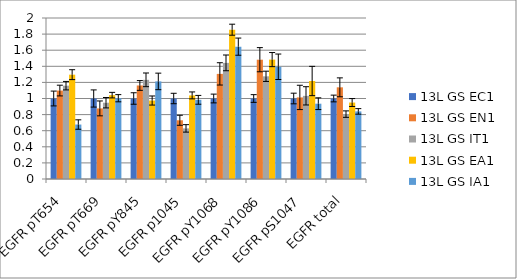
| Category | 13L GS EC1 | 13L GS EN1 | 13L GS IT1 | 13L GS EA1 | 13L GS IA1 |
|---|---|---|---|---|---|
| EGFR pT654 | 1 | 1.099 | 1.159 | 1.296 | 0.677 |
| EGFR pT669 | 1 | 0.877 | 0.948 | 1.042 | 1.003 |
| EGFR pY845 | 1 | 1.162 | 1.232 | 0.975 | 1.212 |
| EGFR p1045 | 1 | 0.73 | 0.629 | 1.039 | 0.984 |
| EGFR pY1068 | 1 | 1.306 | 1.443 | 1.855 | 1.644 |
| EGFR pY1086 | 1 | 1.482 | 1.276 | 1.483 | 1.394 |
| EGFR pS1047 | 1 | 1.013 | 1.033 | 1.217 | 0.936 |
| EGFR total | 1 | 1.139 | 0.806 | 0.95 | 0.84 |